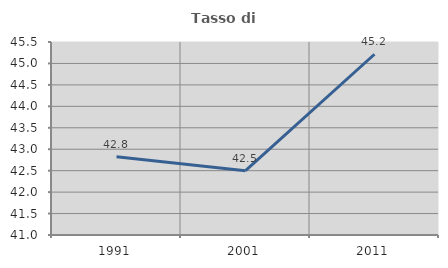
| Category | Tasso di occupazione   |
|---|---|
| 1991.0 | 42.824 |
| 2001.0 | 42.501 |
| 2011.0 | 45.214 |